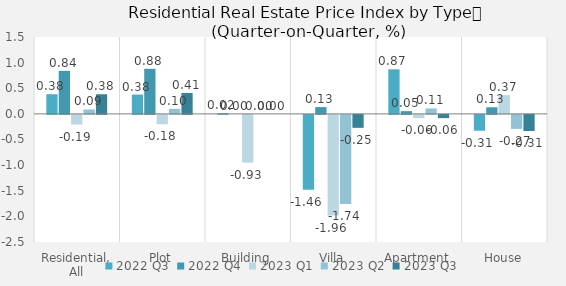
| Category | 2022 | 2023 |
|---|---|---|
| Residential, All | 0.839 | 0.383 |
| Plot | 0.879 | 0.408 |
| Building | 0 | 0 |
| Villa | 0.132 | -0.253 |
| Apartment | 0.053 | -0.063 |
| House | 0.128 | -0.315 |